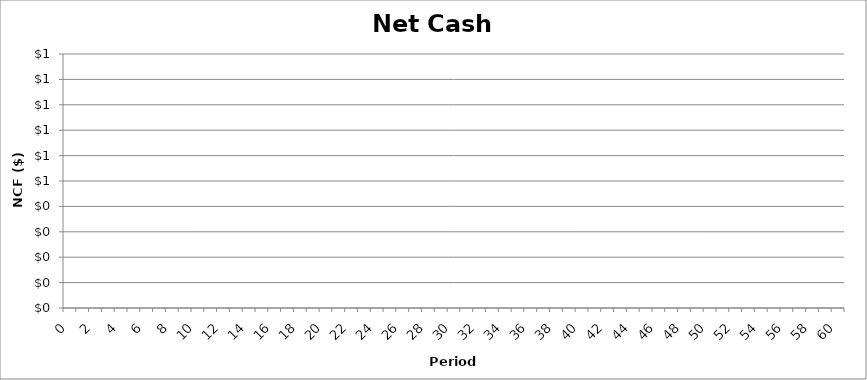
| Category | Net Cash Flow |
|---|---|
| 0.0 | 0 |
| 1.0 | 0 |
| 2.0 | 0 |
| 3.0 | 0 |
| 4.0 | 0 |
| 5.0 | 0 |
| 6.0 | 0 |
| 7.0 | 0 |
| 8.0 | 0 |
| 9.0 | 0 |
| 10.0 | 0 |
| 11.0 | 0 |
| 12.0 | 0 |
| 13.0 | 0 |
| 14.0 | 0 |
| 15.0 | 0 |
| 16.0 | 0 |
| 17.0 | 0 |
| 18.0 | 0 |
| 19.0 | 0 |
| 20.0 | 0 |
| 21.0 | 0 |
| 22.0 | 0 |
| 23.0 | 0 |
| 24.0 | 0 |
| 25.0 | 0 |
| 26.0 | 0 |
| 27.0 | 0 |
| 28.0 | 0 |
| 29.0 | 0 |
| 30.0 | 0 |
| 31.0 | 0 |
| 32.0 | 0 |
| 33.0 | 0 |
| 34.0 | 0 |
| 35.0 | 0 |
| 36.0 | 0 |
| 37.0 | 0 |
| 38.0 | 0 |
| 39.0 | 0 |
| 40.0 | 0 |
| 41.0 | 0 |
| 42.0 | 0 |
| 43.0 | 0 |
| 44.0 | 0 |
| 45.0 | 0 |
| 46.0 | 0 |
| 47.0 | 0 |
| 48.0 | 0 |
| 49.0 | 0 |
| 50.0 | 0 |
| 51.0 | 0 |
| 52.0 | 0 |
| 53.0 | 0 |
| 54.0 | 0 |
| 55.0 | 0 |
| 56.0 | 0 |
| 57.0 | 0 |
| 58.0 | 0 |
| 59.0 | 0 |
| 60.0 | 0 |